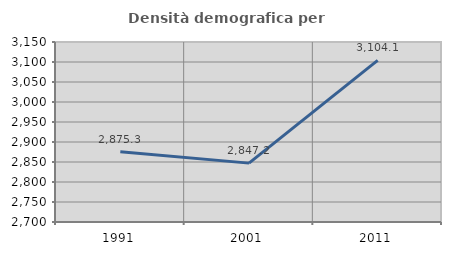
| Category | Densità demografica |
|---|---|
| 1991.0 | 2875.329 |
| 2001.0 | 2847.193 |
| 2011.0 | 3104.1 |